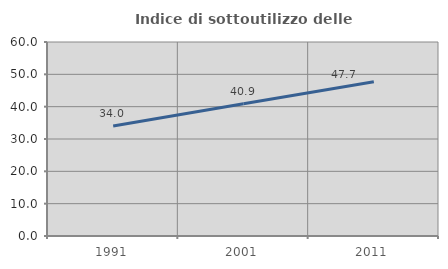
| Category | Indice di sottoutilizzo delle abitazioni  |
|---|---|
| 1991.0 | 33.993 |
| 2001.0 | 40.892 |
| 2011.0 | 47.689 |